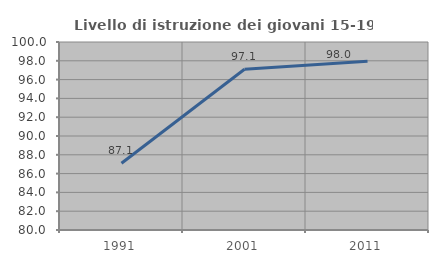
| Category | Livello di istruzione dei giovani 15-19 anni |
|---|---|
| 1991.0 | 87.103 |
| 2001.0 | 97.098 |
| 2011.0 | 97.954 |